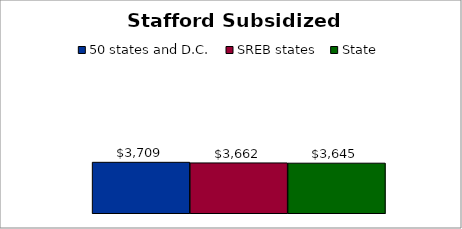
| Category | 50 states and D.C. | SREB states | State |
|---|---|---|---|
| 0 | 3708.565 | 3662.367 | 3644.699 |